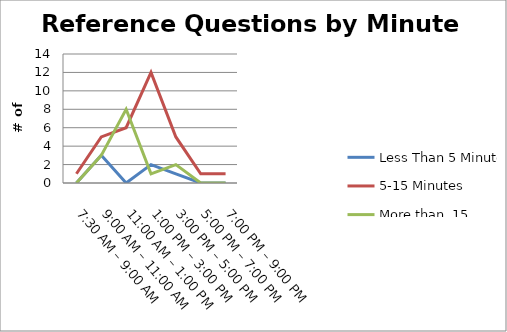
| Category | Less Than 5 Minutes | 5-15 Minutes | More than  15 Minutes |
|---|---|---|---|
| 7:30 AM – 9:00 AM | 0 | 1 | 0 |
| 9:00 AM – 11:00 AM | 3 | 5 | 3 |
| 11:00 AM – 1:00 PM | 0 | 6 | 8 |
| 1:00 PM – 3:00 PM | 2 | 12 | 1 |
| 3:00 PM – 5:00 PM | 1 | 5 | 2 |
| 5:00 PM – 7:00 PM | 0 | 1 | 0 |
| 7:00 PM – 9:00 PM | 0 | 1 | 0 |